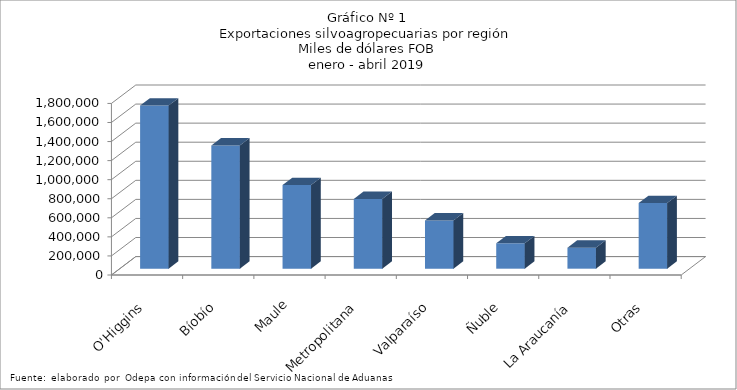
| Category | Series 0 |
|---|---|
| O'Higgins | 1711665.112 |
| Bíobío | 1292591.562 |
| Maule | 877378.36 |
| Metropolitana | 731865.327 |
| Valparaíso | 505868.162 |
| Ñuble | 266492.801 |
| La Araucanía | 220154.806 |
| Otras | 687999.452 |